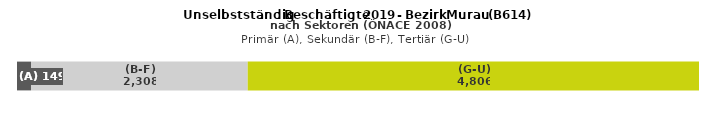
| Category | (A) | (B-F) | (G-U) |
|---|---|---|---|
| 0 | 149 | 2308 | 4806 |